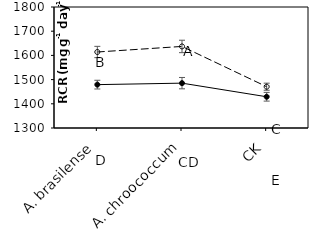
| Category | aCO2 | eCO2 |
|---|---|---|
|    A. brasilense | 1479.191 | 1614.05 |
|    A. chroococcum | 1485.35 | 1637.055 |
| CK | 1429.121 | 1470.637 |